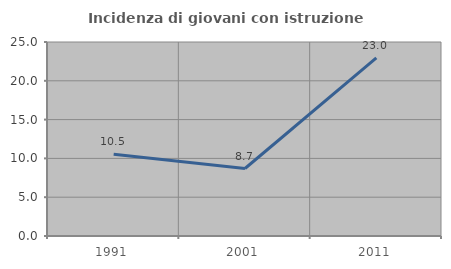
| Category | Incidenza di giovani con istruzione universitaria |
|---|---|
| 1991.0 | 10.526 |
| 2001.0 | 8.696 |
| 2011.0 | 22.955 |